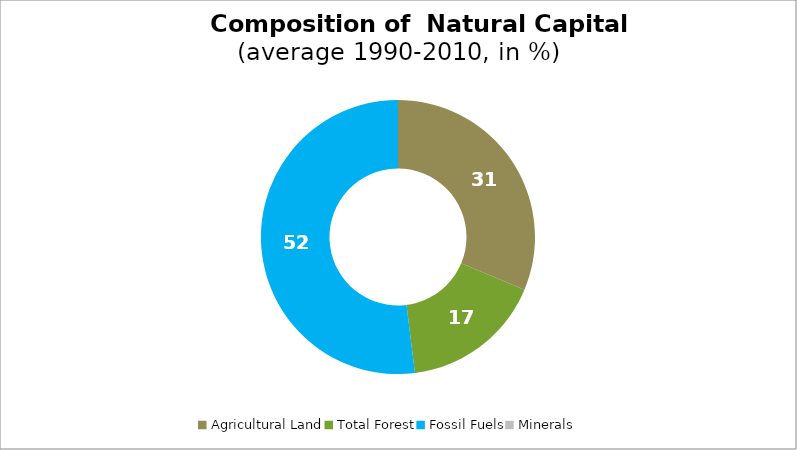
| Category | Series 0 |
|---|---|
| Agricultural Land | 31.29 |
| Total Forest | 16.732 |
| Fossil Fuels | 51.978 |
| Minerals | 0 |